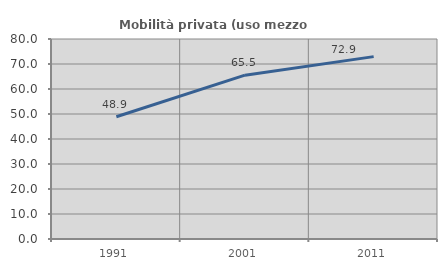
| Category | Mobilità privata (uso mezzo privato) |
|---|---|
| 1991.0 | 48.889 |
| 2001.0 | 65.537 |
| 2011.0 | 72.948 |